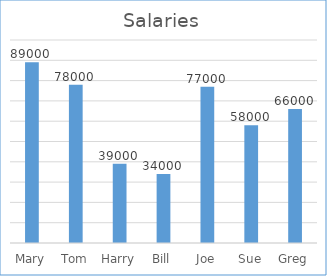
| Category | Series 0 |
|---|---|
| Mary | 89000 |
| Tom | 78000 |
| Harry | 39000 |
| Bill | 34000 |
| Joe | 77000 |
| Sue | 58000 |
| Greg | 66000 |